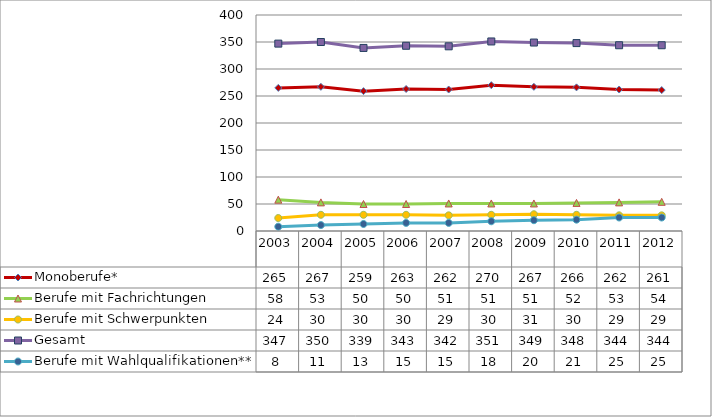
| Category | Monoberufe* | Berufe mit Fachrichtungen | Berufe mit Schwerpunkten | Gesamt | Berufe mit Wahlqualifikationen** |
|---|---|---|---|---|---|
| 2003.0 | 265 | 58 | 24 | 347 | 8 |
| 2004.0 | 267 | 53 | 30 | 350 | 11 |
| 2005.0 | 259 | 50 | 30 | 339 | 13 |
| 2006.0 | 263 | 50 | 30 | 343 | 15 |
| 2007.0 | 262 | 51 | 29 | 342 | 15 |
| 2008.0 | 270 | 51 | 30 | 351 | 18 |
| 2009.0 | 267 | 51 | 31 | 349 | 20 |
| 2010.0 | 266 | 52 | 30 | 348 | 21 |
| 2011.0 | 262 | 53 | 29 | 344 | 25 |
| 2012.0 | 261 | 54 | 29 | 344 | 25 |